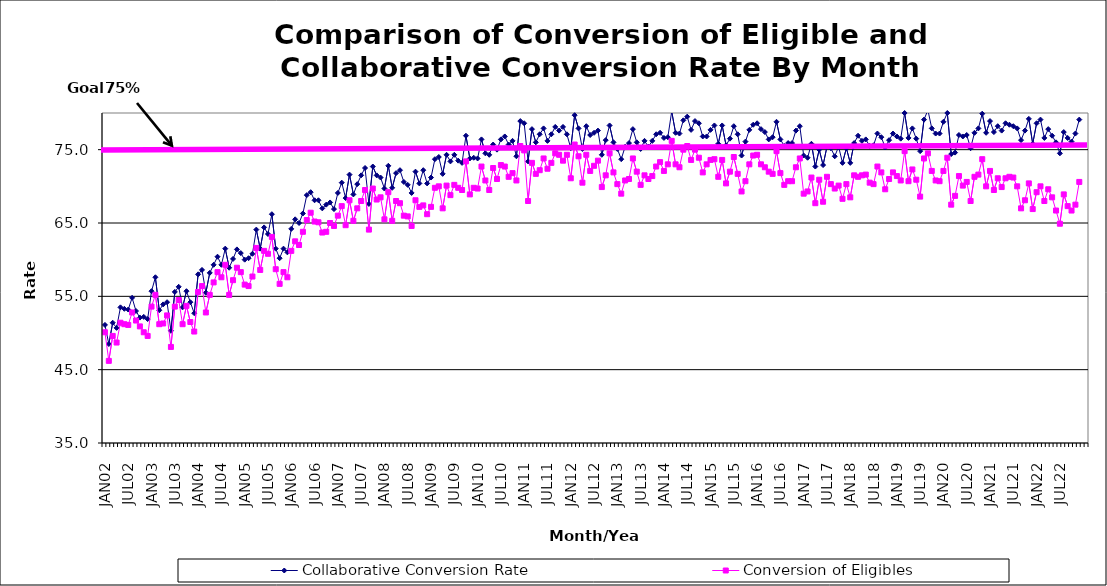
| Category | Collaborative Conversion Rate | Conversion of Eligibles |
|---|---|---|
| JAN02 | 51.1 | 50.1 |
| FEB02 | 48.5 | 46.2 |
| MAR02 | 51.4 | 49.6 |
| APR02 | 50.7 | 48.7 |
| MAY02 | 53.5 | 51.4 |
| JUN02 | 53.3 | 51.2 |
| JUL02 | 53.2 | 51.1 |
| AUG02 | 54.8 | 52.8 |
| SEP02 | 53 | 51.7 |
| OCT02 | 52.1 | 50.9 |
| NOV02 | 52.2 | 50.1 |
| DEC02 | 51.9 | 49.6 |
| JAN03 | 55.7 | 53.6 |
| FEB03 | 57.6 | 55.2 |
| MAR03 | 53.1 | 51.2 |
| APR03 | 53.9 | 51.3 |
| MAY03 | 54.2 | 52.4 |
| JUN03 | 50.3 | 48.1 |
| JUL03 | 55.6 | 53.6 |
| AUG03 | 56.3 | 54.5 |
| SEP03 | 53.5 | 51.2 |
| OCT03 | 55.7 | 53.7 |
| NOV03 | 54.2 | 51.5 |
| DEC03 | 52.7 | 50.2 |
| JAN04 | 58 | 55.6 |
| FEB04 | 58.6 | 56.4 |
| MAR04 | 55.5 | 52.8 |
| APR04 | 58.2 | 55.2 |
| MAY04 | 59.3 | 56.9 |
| JUN04 | 60.4 | 58.3 |
| JUL04 | 59.3 | 57.6 |
| AUG04 | 61.5 | 59.3 |
| SEP04 | 58.9 | 55.2 |
| OCT04 | 60.1 | 57.2 |
| NOV04 | 61.4 | 58.9 |
| DEC04 | 60.9 | 58.3 |
| JAN05 | 60 | 56.6 |
| FEB05 | 60.2 | 56.4 |
| MAR05 | 60.8 | 57.7 |
| APR05 | 64.1 | 61.6 |
| MAY05 | 61.5 | 58.6 |
| JUN05 | 64.4 | 61.2 |
| JUL05 | 63.5 | 60.8 |
| AUG05 | 66.2 | 63.1 |
| SEP05 | 61.5 | 58.7 |
| OCT05 | 60.2 | 56.7 |
| NOV05 | 61.5 | 58.3 |
| DEC05 | 61 | 57.6 |
| JAN06 | 64.2 | 61.2 |
| FEB06 | 65.5 | 62.5 |
| MAR06 | 65 | 62 |
| APR06 | 66.3 | 63.8 |
| MAY06 | 68.8 | 65.4 |
| JUN06 | 69.2 | 66.4 |
| JUL06 | 68.1 | 65.2 |
| AUG06 | 68.1 | 65.1 |
| SEP06 | 67 | 63.7 |
| OCT06 | 67.5 | 63.8 |
| NOV06 | 67.8 | 65 |
| DEC06 | 66.9 | 64.6 |
| JAN07 | 69.1 | 66 |
| FEB07 | 70.5 | 67.3 |
| MAR07 | 68.4 | 64.7 |
| APR07 | 71.6 | 68.1 |
| MAY07 | 68.9 | 65.3 |
| JUN07 | 70.3 | 67 |
| JUL07 | 71.5 | 68 |
| AUG07 | 72.5 | 69.5 |
| SEP07 | 67.6 | 64.1 |
| OCT07 | 72.7 | 69.7 |
| NOV07 | 71.5 | 68.2 |
| DEC07 | 71.2 | 68.5 |
| JAN08 | 69.7 | 65.5 |
| FEB08 | 72.8 | 69.2 |
| MAR08 | 69.8 | 65.3 |
| APR08 | 71.8 | 68 |
| MAY08 | 72.2 | 67.7 |
| JUN08 | 70.6 | 66 |
| JUL08 | 70.2 | 65.9 |
| AUG08 | 69.1 | 64.6 |
| SEP08 | 72 | 68.1 |
| OCT08 | 70.4 | 67.2 |
| NOV08 | 72.2 | 67.4 |
| DEC08 | 70.4 | 66.2 |
| JAN09 | 71.2 | 67.2 |
| FEB09 | 73.7 | 69.8 |
| MAR09 | 74 | 70 |
| APR09 | 71.7 | 67 |
| MAY09 | 74.3 | 70.1 |
| JUN09 | 73.4 | 68.8 |
| JUL09 | 74.3 | 70.2 |
| AUG09 | 73.5 | 69.8 |
| SEP09 | 73.2 | 69.5 |
| OCT09 | 76.9 | 73.4 |
| NOV09 | 73.8 | 68.9 |
| DEC09 | 73.9 | 69.8 |
| JAN10 | 73.8 | 69.7 |
| FEB10 | 76.4 | 72.7 |
| MAR10 | 74.5 | 70.8 |
| APR10 | 74.3 | 69.5 |
| MAY10 | 75.7 | 72.5 |
| JUN10 | 75 | 71 |
| JUL10 | 76.4 | 72.9 |
| AUG10 | 76.8 | 72.7 |
| SEP10 | 75.7 | 71.3 |
| OCT10 | 76.2 | 71.8 |
| NOV10 | 74.1 | 70.8 |
| DEC10 | 78.9 | 75.5 |
| JAN11 | 78.6 | 74.9 |
| FEB11 | 73.4 | 68 |
| MAR11 | 77.8 | 73.2 |
| APR11 | 76 | 71.7 |
| MAY11 | 77.1 | 72.2 |
| JUN11 | 77.9 | 73.8 |
| JUL11 | 76.2 | 72.4 |
| AUG11 | 77.1 | 73.2 |
| SEP11 | 78.1 | 74.5 |
| OCT11 | 77.6 | 74.3 |
| NOV11 | 78.1 | 73.5 |
| DEC11 | 77.1 | 74.3 |
| JAN12 | 75.2 | 71.1 |
| FEB12 | 79.7 | 75.7 |
| MAR12 | 77.9 | 74.1 |
| APR12 | 75.1 | 70.5 |
| MAY12 | 78.2 | 74.3 |
| JUN12 | 77 | 72.1 |
| JUL12 | 77.3 | 72.8 |
| AUG12 | 77.6 | 73.5 |
| SEP12 | 74.3 | 69.9 |
| OCT12 | 76.3 | 71.5 |
| NOV12 | 78.3 | 74.5 |
| DEC12 | 76 | 71.9 |
| JAN13 | 75.1 | 70.3 |
| FEB13 | 73.7 | 69 |
| MAR13 | 75.4 | 70.8 |
| APR13 | 75.9 | 71 |
| MAY13 | 77.8 | 73.8 |
| JUN13 | 76 | 72 |
| JUL13 | 75.1 | 70.2 |
| AUG13 | 76.2 | 71.5 |
| SEP13 | 75.4 | 71 |
| OCT13 | 76.2 | 71.4 |
| NOV13 | 77.1 | 72.7 |
| DEC13 | 77.3 | 73.3 |
| JAN14 | 76.6 | 72.1 |
| FEB14 | 76.7 | 73 |
| MAR14 | 80.2 | 76.2 |
| APR14 | 77.3 | 73 |
| MAY14 | 77.2 | 72.6 |
| JUN14 | 79 | 75 |
| JUL14 | 79.5 | 75.5 |
| AUG14 | 77.7 | 73.6 |
| SEP14 | 78.9 | 75 |
| OCT14 | 78.6 | 73.9 |
| NOV14 | 76.8 | 71.9 |
| DEC14 | 76.8 | 73 |
| JAN15 | 77.7 | 73.6 |
| FEB15 | 78.3 | 73.7 |
| MAR15 | 75.8 | 71.3 |
| APR15 | 78.3 | 73.6 |
| MAY15 | 75.6 | 70.4 |
| JUN15 | 76.5 | 72 |
| JUL15 | 78.2 | 74 |
| AUG15 | 77.1 | 71.7 |
| SEP15 | 74.2 | 69.3 |
| OCT15 | 76.1 | 70.7 |
| NOV15 | 77.7 | 73 |
| DEC15 | 78.4 | 74.2 |
| JAN16 | 78.6 | 74.3 |
| FEB16 | 77.8 | 73 |
| MAR16 | 77.4 | 72.6 |
| APR16 | 76.4 | 72 |
| MAY16 | 76.7 | 71.7 |
| JUN16 | 78.8 | 74.8 |
| JUL16 | 76.4 | 71.8 |
| AUG16 | 75.5 | 70.2 |
| SEP16 | 75.9 | 70.7 |
| OCT16 | 75.9 | 70.7 |
| NOV16 | 77.6 | 72.6 |
| DEC16 | 78.2 | 73.8 |
| JAN17 | 74.2 | 69 |
| FEB17 | 73.9 | 69.3 |
| MAR17 | 75.8 | 71.2 |
| APR17 | 72.7 | 67.7 |
| MAY17 | 75 | 70.9 |
| JUN17 | 72.9 | 67.9 |
| JUL17 | 75.4 | 71.3 |
| AUG17 | 75.2 | 70.3 |
| SEP17 | 74.1 | 69.7 |
| OCT17 | 75.4 | 70.1 |
| NOV17 | 73.2 | 68.3 |
| DEC17 | 75.2 | 70.3 |
| JAN18 | 73.2 | 68.5 |
| FEB18 | 75.9 | 71.5 |
| MAR18 | 76.9 | 71.3 |
| APR18 | 76.2 | 71.5 |
| MAY18 | 76.4 | 71.6 |
| JUN18 | 75.5 | 70.5 |
| JUL18 | 75.6 | 70.3 |
| AUG18 | 77.2 | 72.7 |
| SEP18 | 76.7 | 71.9 |
| OCT18 | 75.3 | 69.6 |
| NOV18 | 76.3 | 71 |
| DEC18 | 77.2 | 71.9 |
| JAN19 | 76.8 | 71.4 |
| FEB19 | 76.5 | 70.8 |
| MAR19 | 80 | 74.8 |
| APR19 | 76.6 | 70.7 |
| MAY19 | 77.9 | 72.3 |
| JUN19 | 76.5 | 70.9 |
| JUL19 | 74.8 | 68.6 |
| AUG19 | 79.1 | 73.8 |
| SEP19 | 80.4 | 74.5 |
| OCT19 | 77.9 | 72.1 |
| NOV19 | 77.2 | 70.8 |
| DEC19 | 77.2 | 70.7 |
| JAN20 | 78.8 | 72.1 |
| FEB20 | 80 | 73.9 |
| MAR20 | 74.4 | 67.5 |
| APR20 | 74.6 | 68.7 |
| MAY20 | 77 | 71.4 |
| JUN20 | 76.8 | 70.1 |
| JUL20 | 77 | 70.6 |
| AUG20 | 75.2 | 68 |
| SEP20 | 77.3 | 71.3 |
| OCT20 | 77.9 | 71.6 |
| NOV20 | 79.9 | 73.7 |
| DEC20 | 77.3 | 70 |
| JAN21 | 78.9 | 72.1 |
| FEB21 | 77.4 | 69.5 |
| MAR21 | 78.2 | 71.1 |
| APR21 | 77.6 | 69.9 |
| MAY21 | 78.6 | 71.1 |
| JUN21 | 78.4 | 71.3 |
| JUL21 | 78.2 | 71.2 |
| AUG21 | 77.9 | 70 |
| SEP21 | 76.3 | 67 |
| OCT21 | 77.6 | 68.1 |
| NOV21 | 79.2 | 70.4 |
| DEC21 | 75.8 | 66.9 |
| JAN22 | 78.6 | 69.2 |
| FEB22 | 79.1 | 70 |
| MAR22 | 76.6 | 68 |
| APR22 | 77.8 | 69.6 |
| MAY22 | 76.9 | 68.5 |
| JUN22 | 76 | 66.7 |
| JUL22 | 74.5 | 64.9 |
| AUG22 | 77.4 | 68.9 |
| SEP22 | 76.6 | 67.3 |
| OCT22 | 76.1 | 66.7 |
| NOV22 | 77.2 | 67.5 |
| DEC22 | 79.1 | 70.6 |